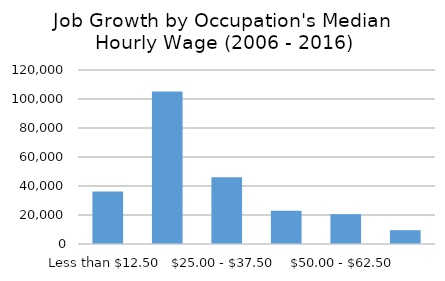
| Category | Series 0 |
|---|---|
| Less than $12.50 | 36293 |
| $12.50 - $25.00 | 105143 |
| $25.00 - $37.50 | 45962 |
| $37.50 - $50.00 | 22933 |
| $50.00 - $62.50 | 20556 |
| Over $62.50  | 9527 |